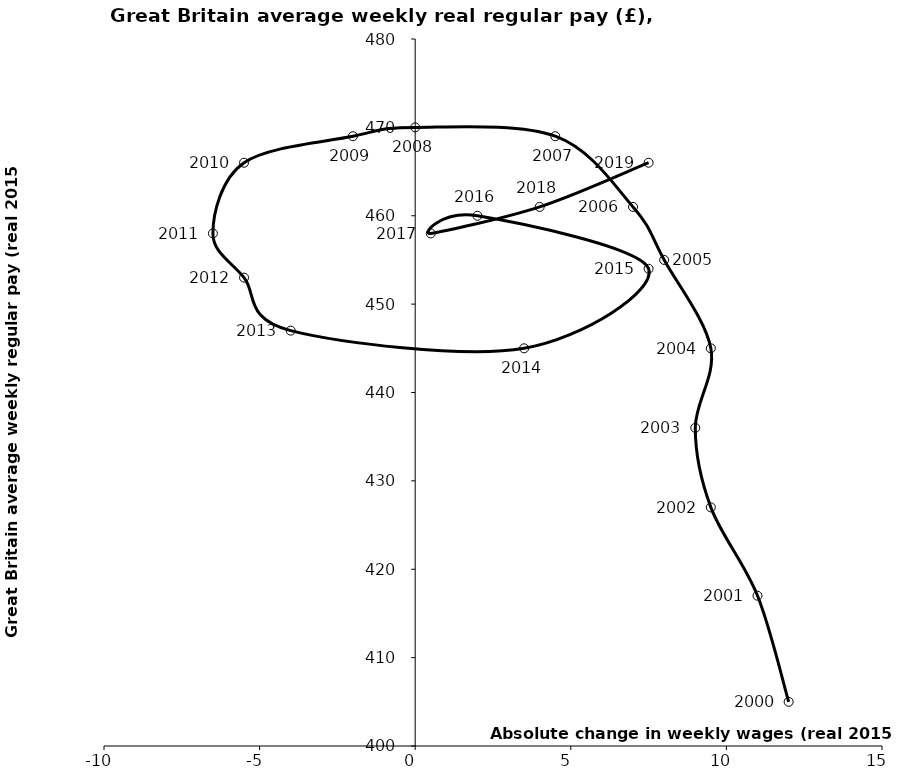
| Category | Series 0 |
|---|---|
| 12.0 | 405 |
| 11.0 | 417 |
| 9.5 | 427 |
| 9.0 | 436 |
| 9.5 | 445 |
| 8.0 | 455 |
| 7.0 | 461 |
| 4.5 | 469 |
| 0.0 | 470 |
| -2.0 | 469 |
| -5.5 | 466 |
| -6.5 | 458 |
| -5.5 | 453 |
| -4.0 | 447 |
| 3.5 | 445 |
| 7.5 | 454 |
| 2.0 | 460 |
| 0.5 | 458 |
| 4.0 | 461 |
| 7.5 | 466 |